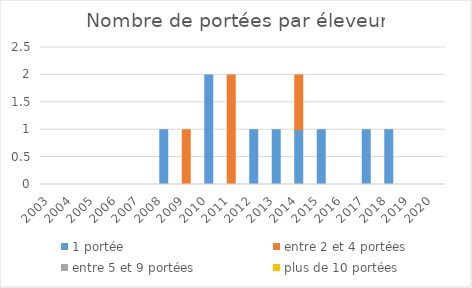
| Category | 1 portée | entre 2 et 4 portées | entre 5 et 9 portées | plus de 10 portées |
|---|---|---|---|---|
| 2003.0 | 0 | 0 | 0 | 0 |
| 2004.0 | 0 | 0 | 0 | 0 |
| 2005.0 | 0 | 0 | 0 | 0 |
| 2006.0 | 0 | 0 | 0 | 0 |
| 2007.0 | 0 | 0 | 0 | 0 |
| 2008.0 | 1 | 0 | 0 | 0 |
| 2009.0 | 0 | 1 | 0 | 0 |
| 2010.0 | 2 | 0 | 0 | 0 |
| 2011.0 | 0 | 2 | 0 | 0 |
| 2012.0 | 1 | 0 | 0 | 0 |
| 2013.0 | 1 | 0 | 0 | 0 |
| 2014.0 | 1 | 1 | 0 | 0 |
| 2015.0 | 1 | 0 | 0 | 0 |
| 2016.0 | 0 | 0 | 0 | 0 |
| 2017.0 | 1 | 0 | 0 | 0 |
| 2018.0 | 1 | 0 | 0 | 0 |
| 2019.0 | 0 | 0 | 0 | 0 |
| 2020.0 | 0 | 0 | 0 | 0 |